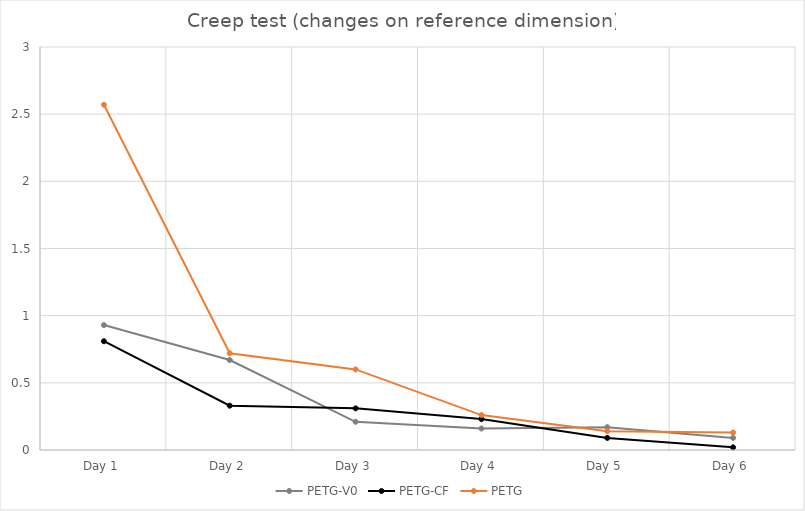
| Category | PETG-V0 | PETG-CF | PETG |
|---|---|---|---|
| Day 1 | 0.93 | 0.81 | 2.57 |
| Day 2 | 0.67 | 0.33 | 0.72 |
| Day 3 | 0.21 | 0.31 | 0.6 |
| Day 4 | 0.16 | 0.23 | 0.26 |
| Day 5 | 0.17 | 0.09 | 0.14 |
| Day 6 | 0.09 | 0.02 | 0.13 |